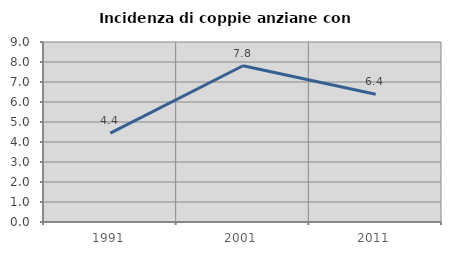
| Category | Incidenza di coppie anziane con figli |
|---|---|
| 1991.0 | 4.444 |
| 2001.0 | 7.812 |
| 2011.0 | 6.383 |